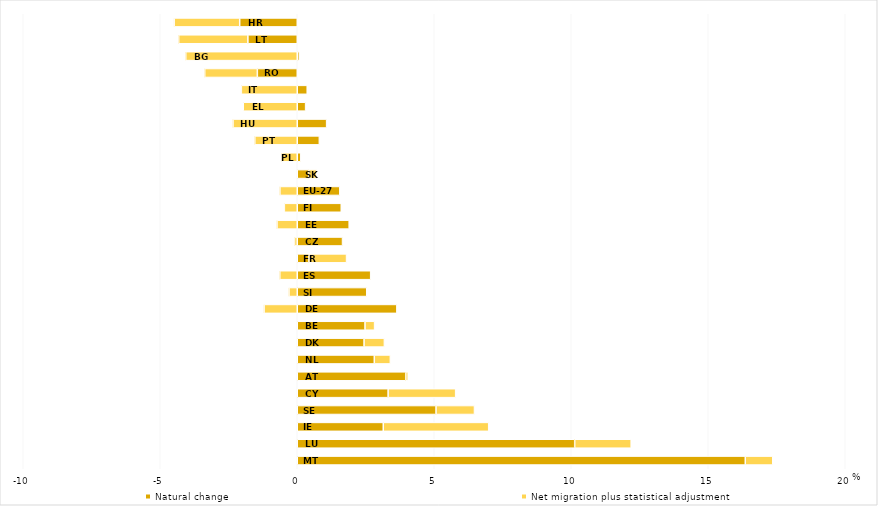
| Category | Natural change | Net migration plus statistical adjustment  |
|---|---|---|
| MT | 16.351 | 1.002 |
| LU | 10.126 | 2.061 |
| IE | 3.139 | 3.848 |
| SE | 5.065 | 1.403 |
| CY | 3.317 | 2.464 |
| AT | 3.96 | 0.09 |
| NL | 2.812 | 0.586 |
| DK | 2.438 | 0.742 |
| BE | 2.473 | 0.35 |
| DE | 3.636 | -1.211 |
| SI | 2.536 | -0.301 |
| ES | 2.68 | -0.637 |
| FR | 0.424 | 1.375 |
| CZ | 1.652 | -0.101 |
| EE | 1.895 | -0.739 |
| FI | 1.606 | -0.471 |
| EU-27 | 1.554 | -0.633 |
| SK | 0.418 | 0.291 |
| PL | 0.13 | -0.566 |
| PT | 0.806 | -1.549 |
| HU | 1.072 | -2.345 |
| EL | 0.305 | -1.971 |
| IT | 0.364 | -2.04 |
| RO | -1.456 | -1.921 |
| BG | 0.076 | -4.069 |
| LT | -1.802 | -2.525 |
| HR | -2.1 | -2.392 |